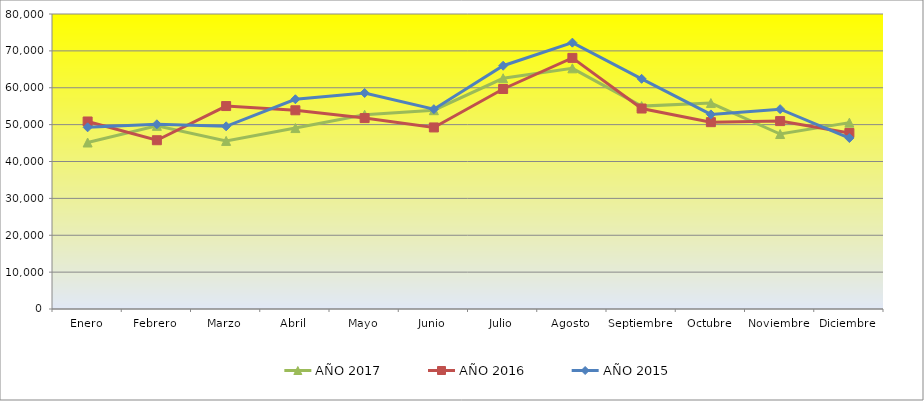
| Category | AÑO 2017 | AÑO 2016 | AÑO 2015 |
|---|---|---|---|
| Enero | 45149.841 | 50850 | 49267 |
| Febrero | 49663.492 | 45768 | 50092 |
| Marzo | 45585.556 | 55037 | 49540 |
| Abril | 49063.81 | 53889 | 56878 |
| Mayo | 52689.841 | 51773 | 58578 |
| Junio | 53915.238 | 49237 | 54193 |
| Julio | 62572.381 | 59662 | 65969 |
| Agosto | 65263.492 | 68100 | 72235 |
| Septiembre | 55017.778 | 54368 | 62421 |
| Octubre | 55849.524 | 50667 | 52773 |
| Noviembre | 47453.016 | 50957 | 54191 |
| Diciembre | 50539.365 | 47739 | 46362 |